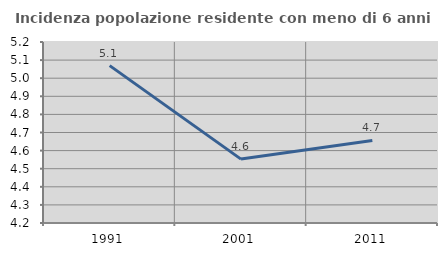
| Category | Incidenza popolazione residente con meno di 6 anni |
|---|---|
| 1991.0 | 5.07 |
| 2001.0 | 4.553 |
| 2011.0 | 4.656 |